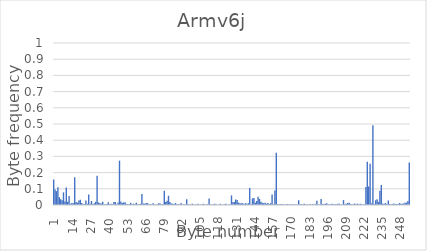
| Category | Series 0 |
|---|---|
| 1.0 | 0.157 |
| 2.0 | 0.096 |
| 3.0 | 0.085 |
| 4.0 | 0.109 |
| 5.0 | 0.047 |
| 6.0 | 0.035 |
| 7.0 | 0.03 |
| 8.0 | 0.078 |
| 9.0 | 0.021 |
| 10.0 | 0.108 |
| 11.0 | 0.02 |
| 12.0 | 0.056 |
| 13.0 | 0.008 |
| 14.0 | 0.012 |
| 15.0 | 0.011 |
| 16.0 | 0.172 |
| 17.0 | 0.019 |
| 18.0 | 0.014 |
| 19.0 | 0.027 |
| 20.0 | 0.033 |
| 21.0 | 0.013 |
| 22.0 | 0.006 |
| 23.0 | 0.006 |
| 24.0 | 0.028 |
| 25.0 | 0.008 |
| 26.0 | 0.065 |
| 27.0 | 0.008 |
| 28.0 | 0.025 |
| 29.0 | 0.004 |
| 30.0 | 0.011 |
| 31.0 | 0.019 |
| 32.0 | 0.181 |
| 33.0 | 0.016 |
| 34.0 | 0.011 |
| 35.0 | 0.01 |
| 36.0 | 0.02 |
| 37.0 | 0.005 |
| 38.0 | 0.004 |
| 39.0 | 0.006 |
| 40.0 | 0.018 |
| 41.0 | 0.004 |
| 42.0 | 0.008 |
| 43.0 | 0.004 |
| 44.0 | 0.018 |
| 45.0 | 0.018 |
| 46.0 | 0.005 |
| 47.0 | 0.016 |
| 48.0 | 0.274 |
| 49.0 | 0.021 |
| 50.0 | 0.012 |
| 51.0 | 0.015 |
| 52.0 | 0.017 |
| 53.0 | 0.007 |
| 54.0 | 0.005 |
| 55.0 | 0.005 |
| 56.0 | 0.014 |
| 57.0 | 0.004 |
| 58.0 | 0.008 |
| 59.0 | 0.005 |
| 60.0 | 0.013 |
| 61.0 | 0.004 |
| 62.0 | 0.005 |
| 63.0 | 0.007 |
| 64.0 | 0.069 |
| 65.0 | 0.009 |
| 66.0 | 0.008 |
| 67.0 | 0.012 |
| 68.0 | 0.012 |
| 69.0 | 0.004 |
| 70.0 | 0.004 |
| 71.0 | 0.005 |
| 72.0 | 0.011 |
| 73.0 | 0.003 |
| 74.0 | 0.003 |
| 75.0 | 0.005 |
| 76.0 | 0.011 |
| 77.0 | 0.01 |
| 78.0 | 0.003 |
| 79.0 | 0.006 |
| 80.0 | 0.088 |
| 81.0 | 0.018 |
| 82.0 | 0.026 |
| 83.0 | 0.057 |
| 84.0 | 0.018 |
| 85.0 | 0.01 |
| 86.0 | 0.008 |
| 87.0 | 0.006 |
| 88.0 | 0.013 |
| 89.0 | 0.005 |
| 90.0 | 0.005 |
| 91.0 | 0.005 |
| 92.0 | 0.012 |
| 93.0 | 0.002 |
| 94.0 | 0.004 |
| 95.0 | 0.003 |
| 96.0 | 0.036 |
| 97.0 | 0.004 |
| 98.0 | 0.003 |
| 99.0 | 0.003 |
| 100.0 | 0.008 |
| 101.0 | 0.003 |
| 102.0 | 0.003 |
| 103.0 | 0.002 |
| 104.0 | 0.008 |
| 105.0 | 0.002 |
| 106.0 | 0.003 |
| 107.0 | 0.003 |
| 108.0 | 0.007 |
| 109.0 | 0.002 |
| 110.0 | 0.003 |
| 111.0 | 0.005 |
| 112.0 | 0.04 |
| 113.0 | 0.004 |
| 114.0 | 0.004 |
| 115.0 | 0.004 |
| 116.0 | 0.008 |
| 117.0 | 0.003 |
| 118.0 | 0.002 |
| 119.0 | 0.002 |
| 120.0 | 0.007 |
| 121.0 | 0.002 |
| 122.0 | 0.003 |
| 123.0 | 0.004 |
| 124.0 | 0.007 |
| 125.0 | 0.002 |
| 126.0 | 0.003 |
| 127.0 | 0.003 |
| 128.0 | 0.059 |
| 129.0 | 0.018 |
| 130.0 | 0.018 |
| 131.0 | 0.034 |
| 132.0 | 0.031 |
| 133.0 | 0.015 |
| 134.0 | 0.01 |
| 135.0 | 0.01 |
| 136.0 | 0.011 |
| 137.0 | 0.006 |
| 138.0 | 0.012 |
| 139.0 | 0.007 |
| 140.0 | 0.011 |
| 141.0 | 0.104 |
| 142.0 | 0.005 |
| 143.0 | 0.041 |
| 144.0 | 0.044 |
| 145.0 | 0.014 |
| 146.0 | 0.025 |
| 147.0 | 0.05 |
| 148.0 | 0.037 |
| 149.0 | 0.02 |
| 150.0 | 0.014 |
| 151.0 | 0.011 |
| 152.0 | 0.015 |
| 153.0 | 0.008 |
| 154.0 | 0.012 |
| 155.0 | 0.007 |
| 156.0 | 0.01 |
| 157.0 | 0.066 |
| 158.0 | 0.004 |
| 159.0 | 0.09 |
| 160.0 | 0.323 |
| 161.0 | 0.004 |
| 162.0 | 0.005 |
| 163.0 | 0.005 |
| 164.0 | 0.007 |
| 165.0 | 0.003 |
| 166.0 | 0.002 |
| 167.0 | 0.002 |
| 168.0 | 0.006 |
| 169.0 | 0.002 |
| 170.0 | 0.004 |
| 171.0 | 0.002 |
| 172.0 | 0.007 |
| 173.0 | 0.002 |
| 174.0 | 0.003 |
| 175.0 | 0.002 |
| 176.0 | 0.03 |
| 177.0 | 0.005 |
| 178.0 | 0.005 |
| 179.0 | 0.005 |
| 180.0 | 0.008 |
| 181.0 | 0.003 |
| 182.0 | 0.003 |
| 183.0 | 0.002 |
| 184.0 | 0.006 |
| 185.0 | 0.002 |
| 186.0 | 0.007 |
| 187.0 | 0.002 |
| 188.0 | 0.007 |
| 189.0 | 0.026 |
| 190.0 | 0.004 |
| 191.0 | 0.004 |
| 192.0 | 0.037 |
| 193.0 | 0.006 |
| 194.0 | 0.006 |
| 195.0 | 0.008 |
| 196.0 | 0.011 |
| 197.0 | 0.005 |
| 198.0 | 0.004 |
| 199.0 | 0.004 |
| 200.0 | 0.007 |
| 201.0 | 0.004 |
| 202.0 | 0.006 |
| 203.0 | 0.004 |
| 204.0 | 0.007 |
| 205.0 | 0.008 |
| 206.0 | 0.003 |
| 207.0 | 0.003 |
| 208.0 | 0.03 |
| 209.0 | 0.007 |
| 210.0 | 0.007 |
| 211.0 | 0.013 |
| 212.0 | 0.013 |
| 213.0 | 0.007 |
| 214.0 | 0.005 |
| 215.0 | 0.005 |
| 216.0 | 0.009 |
| 217.0 | 0.005 |
| 218.0 | 0.008 |
| 219.0 | 0.005 |
| 220.0 | 0.008 |
| 221.0 | 0.005 |
| 222.0 | 0.004 |
| 223.0 | 0.004 |
| 224.0 | 0.112 |
| 225.0 | 0.266 |
| 226.0 | 0.114 |
| 227.0 | 0.255 |
| 228.0 | 0.011 |
| 229.0 | 0.493 |
| 230.0 | 0.006 |
| 231.0 | 0.029 |
| 232.0 | 0.035 |
| 233.0 | 0.019 |
| 234.0 | 0.088 |
| 235.0 | 0.124 |
| 236.0 | 0.008 |
| 237.0 | 0.007 |
| 238.0 | 0.012 |
| 239.0 | 0.006 |
| 240.0 | 0.028 |
| 241.0 | 0.006 |
| 242.0 | 0.005 |
| 243.0 | 0.006 |
| 244.0 | 0.009 |
| 245.0 | 0.005 |
| 246.0 | 0.005 |
| 247.0 | 0.006 |
| 248.0 | 0.012 |
| 249.0 | 0.008 |
| 250.0 | 0.008 |
| 251.0 | 0.009 |
| 252.0 | 0.014 |
| 253.0 | 0.014 |
| 254.0 | 0.025 |
| 255.0 | 0.262 |